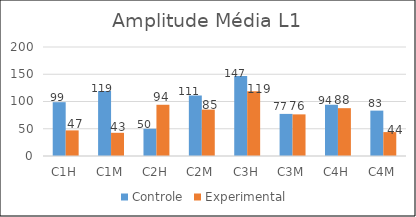
| Category | Controle | Experimental  |
|---|---|---|
| C1H | 98.75 | 47 |
| C1M | 119.25 | 42.563 |
| C2H | 50 | 94 |
| C2M | 111 | 85.125 |
| C3H | 146.75 | 118.625 |
| C3M | 77.25 | 76.375 |
| C4H | 94 | 87.75 |
| C4M | 83.25 | 43.875 |